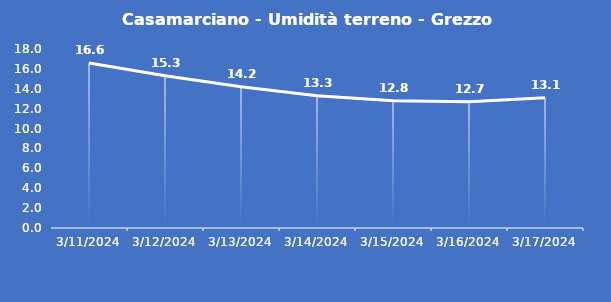
| Category | Casamarciano - Umidità terreno - Grezzo (%VWC) |
|---|---|
| 3/11/24 | 16.6 |
| 3/12/24 | 15.3 |
| 3/13/24 | 14.2 |
| 3/14/24 | 13.3 |
| 3/15/24 | 12.8 |
| 3/16/24 | 12.7 |
| 3/17/24 | 13.1 |